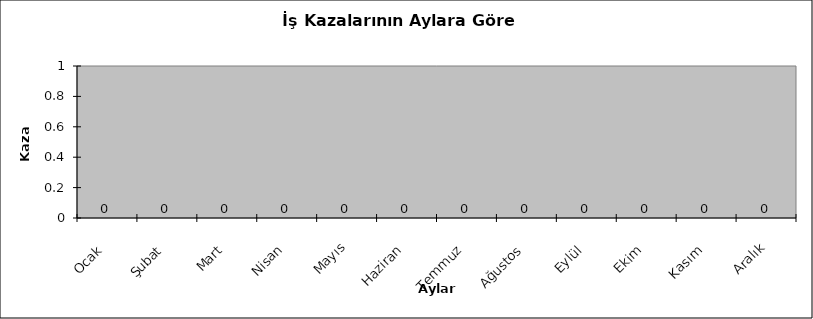
| Category | Series 1 |
|---|---|
| Ocak | 0 |
| Şubat | 0 |
| Mart | 0 |
| Nisan | 0 |
| Mayıs | 0 |
| Haziran | 0 |
| Temmuz | 0 |
| Ağustos | 0 |
| Eylül | 0 |
| Ekim | 0 |
| Kasım | 0 |
| Aralık | 0 |